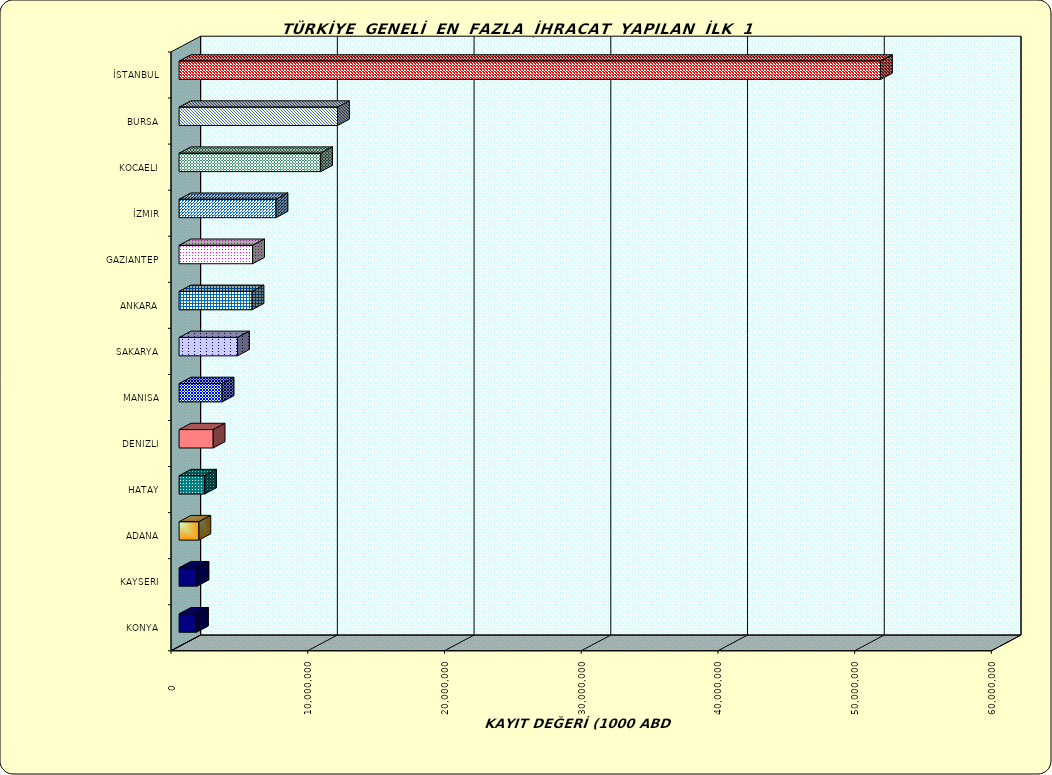
| Category | Series 0 |
|---|---|
| İSTANBUL | 51300921.365 |
| BURSA | 11587090.965 |
| KOCAELI | 10356129.568 |
| İZMIR | 7092603.417 |
| GAZIANTEP | 5379815.617 |
| ANKARA | 5338455.957 |
| SAKARYA | 4276561.111 |
| MANISA | 3150449.22 |
| DENIZLI | 2493536.378 |
| HATAY | 1865214.098 |
| ADANA | 1451720.463 |
| KAYSERI | 1316137.222 |
| KONYA | 1277110.459 |